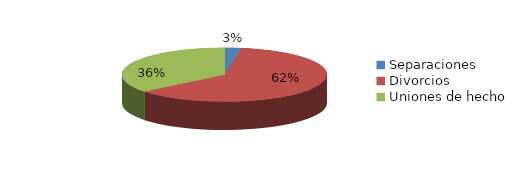
| Category | Series 0 |
|---|---|
| Separaciones | 14 |
| Divorcios | 335 |
| Uniones de hecho | 195 |